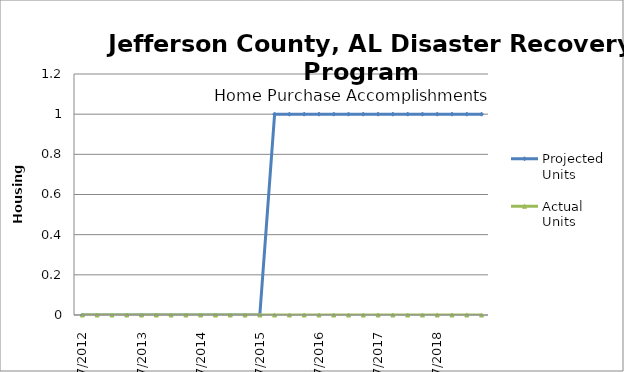
| Category | Projected Units | Actual Units |
|---|---|---|
| 7/2012 | 0 | 0 |
| 10/2012 | 0 | 0 |
| 1/2013 | 0 | 0 |
| 4/2013 | 0 | 0 |
| 7/2013 | 0 | 0 |
| 10/2013 | 0 | 0 |
| 1/2014 | 0 | 0 |
| 4/2014 | 0 | 0 |
| 7/2014 | 0 | 0 |
| 10/2014 | 0 | 0 |
| 1/2015 | 0 | 0 |
| 4/2015 | 0 | 0 |
| 7/2015 | 0 | 0 |
| 10/2015 | 1 | 0 |
| 1/2016 | 1 | 0 |
| 4/2016 | 1 | 0 |
| 7/2016 | 1 | 0 |
| 10/2016 | 1 | 0 |
| 1/2017 | 1 | 0 |
| 4/2017 | 1 | 0 |
| 7/2017 | 1 | 0 |
| 10/2017 | 1 | 0 |
| 1/2018 | 1 | 0 |
| 4/2018 | 1 | 0 |
| 7/2018 | 1 | 0 |
| 10/2018 | 1 | 0 |
| 1/2019 | 1 | 0 |
| 4/2019 | 1 | 0 |